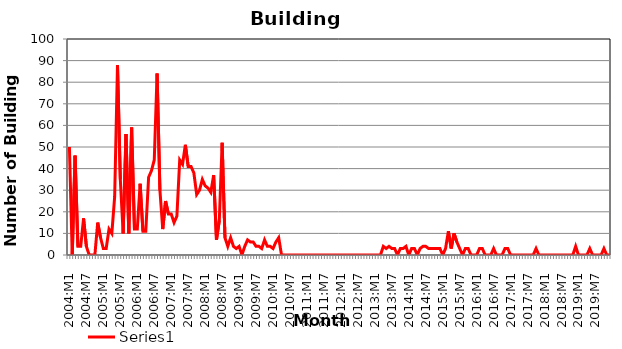
| Category | Series 0 |
|---|---|
| 2004:M1 | 50 |
| 2004:M2 | 0 |
| 2004:M3 | 46 |
| 2004:M4 | 4 |
| 2004:M5 | 4 |
| 2004:M6 | 17 |
| 2004:M7 | 4 |
| 2004:M8 | 0 |
| 2004:M9 | 0 |
| 2004:M10 | 0 |
| 2004:M11 | 15 |
| 2004:M12 | 8 |
| 2005:M1 | 3 |
| 2005:M2 | 3 |
| 2005:M3 | 12 |
| 2005:M4 | 10 |
| 2005:M5 | 27 |
| 2005:M6 | 88 |
| 2005:M7 | 35 |
| 2005:M8 | 10 |
| 2005:M9 | 56 |
| 2005:M10 | 10 |
| 2005:M11 | 59 |
| 2005:M12 | 12 |
| 2006:M1 | 12 |
| 2006:M2 | 33 |
| 2006:M3 | 11 |
| 2006:M4 | 11 |
| 2006:M5 | 36 |
| 2006:M6 | 39 |
| 2006:M7 | 44 |
| 2006:M8 | 84 |
| 2006:M9 | 30 |
| 2006:M10 | 12 |
| 2006:M11 | 25 |
| 2006:M12 | 19 |
| 2007:M1 | 19 |
| 2007:M2 | 15 |
| 2007:M3 | 18 |
| 2007:M4 | 44 |
| 2007:M5 | 42 |
| 2007:M6 | 51 |
| 2007:M7 | 41 |
| 2007:M8 | 41 |
| 2007:M9 | 38 |
| 2007:M10 | 28 |
| 2007:M11 | 30 |
| 2007:M12 | 35 |
| 2008:M1 | 32 |
| 2008:M2 | 31 |
| 2008:M3 | 29 |
| 2008:M4 | 37 |
| 2008:M5 | 7 |
| 2008:M6 | 16 |
| 2008:M7 | 52 |
| 2008:M8 | 8 |
| 2008:M9 | 4 |
| 2008:M10 | 8 |
| 2008:M11 | 4 |
| 2008:M12 | 3 |
| 2009:M1 | 4 |
| 2009:M2 | 0 |
| 2009:M3 | 4 |
| 2009:M4 | 7 |
| 2009:M5 | 6 |
| 2009:M6 | 6 |
| 2009:M7 | 4 |
| 2009:M8 | 4 |
| 2009:M9 | 3 |
| 2009:M10 | 7 |
| 2009:M11 | 4 |
| 2009:M12 | 4 |
| 2010:M1 | 3 |
| 2010:M2 | 6 |
| 2010:M3 | 8 |
| 2010:M4 | 0 |
| 2010:M5 | 0 |
| 2010:M6 | 0 |
| 2010:M7 | 0 |
| 2010:M8 | 0 |
| 2010:M9 | 0 |
| 2010:M10 | 0 |
| 2010:M11 | 0 |
| 2010:M12 | 0 |
| 2011:M1 | 0 |
| 2011:M2 | 0 |
| 2011:M3 | 0 |
| 2011:M4 | 0 |
| 2011:M5 | 0 |
| 2011:M6 | 0 |
| 2011:M7 | 0 |
| 2011:M8 | 0 |
| 2011:M9 | 0 |
| 2011:M10 | 0 |
| 2011:M11 | 0 |
| 2011:M12 | 0 |
| 2012:M1 | 0 |
| 2012:M2 | 0 |
| 2012:M3 | 0 |
| 2012:M4 | 0 |
| 2012:M5 | 0 |
| 2012:M6 | 0 |
| 2012:M7 | 0 |
| 2012:M8 | 0 |
| 2012:M9 | 0 |
| 2012:M10 | 0 |
| 2012:M11 | 0 |
| 2012:M12 | 0 |
| 2013:M1 | 0 |
| 2013:M2 | 0 |
| 2013:M3 | 0 |
| 2013:M4 | 4 |
| 2013:M5 | 3 |
| 2013:M6 | 4 |
| 2013:M7 | 3 |
| 2013:M8 | 3 |
| 2013:M9 | 0 |
| 2013:M10 | 3 |
| 2013:M11 | 3 |
| 2013:M12 | 4 |
| 2014:M1 | 0 |
| 2014:M2 | 3 |
| 2014:M3 | 3 |
| 2014:M4 | 0 |
| 2014:M5 | 3 |
| 2014:M6 | 4 |
| 2014:M7 | 4 |
| 2014:M8 | 3 |
| 2014:M9 | 3 |
| 2014:M10 | 3 |
| 2014:M11 | 3 |
| 2014:M12 | 3 |
| 2015:M1 | 0 |
| 2015:M2 | 3 |
| 2015:M3 | 11 |
| 2015:M4 | 3 |
| 2015:M5 | 10 |
| 2015:M6 | 6 |
| 2015:M7 | 3 |
| 2015:M8 | 0 |
| 2015:M9 | 3 |
| 2015:M10 | 3 |
| 2015:M11 | 0 |
| 2015:M12 | 0 |
| 2016:M1 | 0 |
| 2016:M2 | 3 |
| 2016:M3 | 3 |
| 2016:M4 | 0 |
| 2016:M5 | 0 |
| 2016:M6 | 0 |
| 2016:M7 | 3 |
| 2016:M8 | 0 |
| 2016:M9 | 0 |
| 2016:M10 | 0 |
| 2016:M11 | 3 |
| 2016:M12 | 3 |
| 2017:M1 | 0 |
| 2017:M2 | 0 |
| 2017:M3 | 0 |
| 2017:M4 | 0 |
| 2017:M5 | 0 |
| 2017:M6 | 0 |
| 2017:M7 | 0 |
| 2017:M8 | 0 |
| 2017:M9 | 0 |
| 2017:M10 | 3 |
| 2017:M11 | 0 |
| 2017:M12 | 0 |
| 2018:M1 | 0 |
| 2018:M2 | 0 |
| 2018:M3 | 0 |
| 2018:M4 | 0 |
| 2018:M5 | 0 |
| 2018:M6 | 0 |
| 2018:M7 | 0 |
| 2018:M8 | 0 |
| 2018:M9 | 0 |
| 2018:M10 | 0 |
| 2018:M11 | 0 |
| 2018:M12 | 4 |
| 2019:M1 | 0 |
| 2019:M2 | 0 |
| 2019:M3 | 0 |
| 2019:M4 | 0 |
| 2019:M5 | 3 |
| 2019:M6 | 0 |
| 2019:M7 | 0 |
| 2019:M8 | 0 |
| 2019:M9 | 0 |
| 2019:M10 | 3 |
| 2019:M11 | 0 |
| 2019:M12 | 0 |